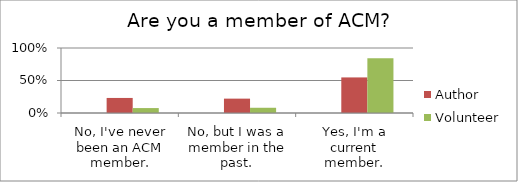
| Category | Fellow | Author | Volunteer |
|---|---|---|---|
| No, I've never been an ACM member. | 0 | 0.232 | 0.076 |
| No, but I was a member in the past. | 0 | 0.221 | 0.081 |
| Yes, I'm a current member. | 0 | 0.547 | 0.844 |